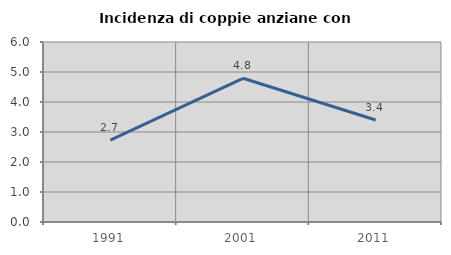
| Category | Incidenza di coppie anziane con figli |
|---|---|
| 1991.0 | 2.732 |
| 2001.0 | 4.79 |
| 2011.0 | 3.401 |